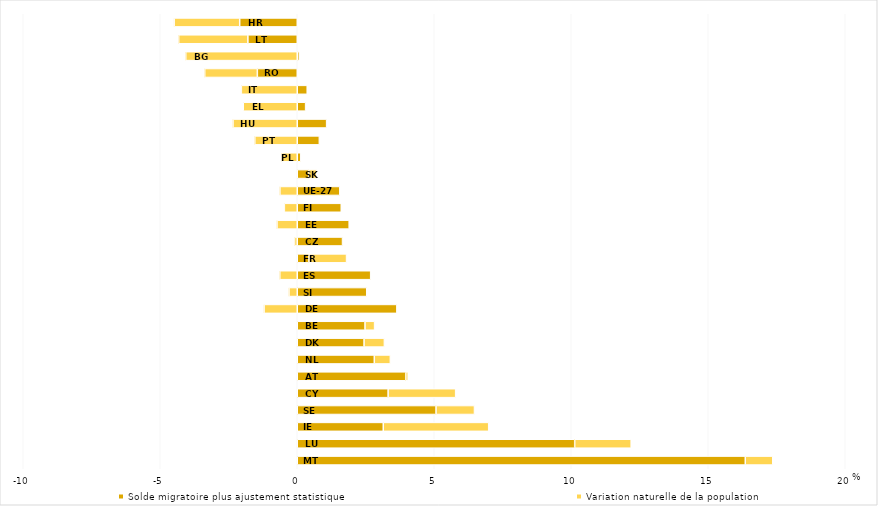
| Category | Solde migratoire plus ajustement statistique | Variation naturelle de la population |
|---|---|---|
| MT | 16.351 | 1.002 |
| LU | 10.126 | 2.061 |
| IE | 3.139 | 3.848 |
| SE | 5.065 | 1.403 |
| CY | 3.317 | 2.464 |
| AT | 3.96 | 0.09 |
| NL | 2.812 | 0.586 |
| DK | 2.438 | 0.742 |
| BE | 2.473 | 0.35 |
| DE | 3.636 | -1.211 |
| SI | 2.536 | -0.301 |
| ES | 2.68 | -0.637 |
| FR | 0.424 | 1.375 |
| CZ | 1.652 | -0.101 |
| EE | 1.895 | -0.739 |
| FI | 1.606 | -0.471 |
| UE-27 | 1.554 | -0.633 |
| SK | 0.418 | 0.291 |
| PL | 0.13 | -0.566 |
| PT | 0.806 | -1.549 |
| HU | 1.072 | -2.345 |
| EL | 0.305 | -1.971 |
| IT | 0.364 | -2.04 |
| RO | -1.456 | -1.921 |
| BG | 0.076 | -4.069 |
| LT | -1.802 | -2.525 |
| HR | -2.1 | -2.392 |